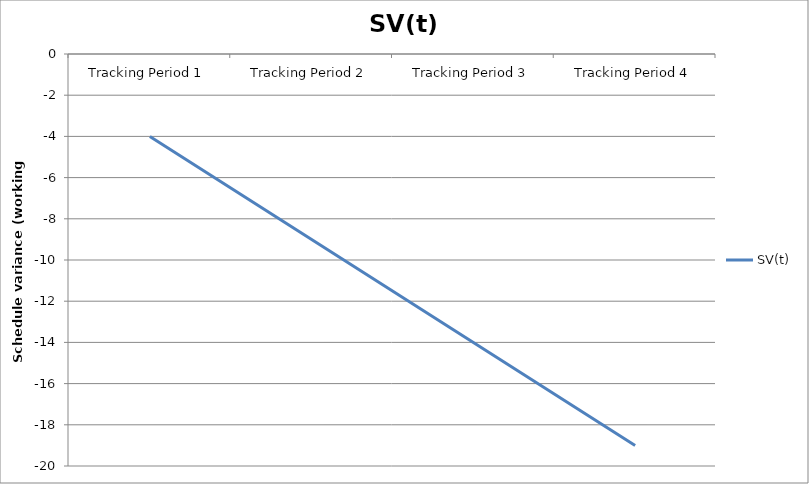
| Category | SV(t) |
|---|---|
| Tracking Period 1 | -4 |
| Tracking Period 2 | -9 |
| Tracking Period 3 | -14 |
| Tracking Period 4 | -19 |